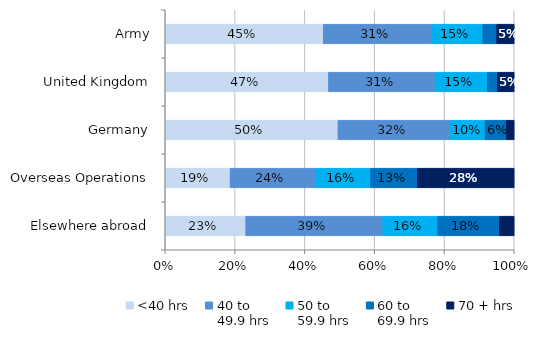
| Category | <40 hrs | 40 to 
49.9 hrs | 50 to 
59.9 hrs | 60 to 
69.9 hrs | 70 + hrs |
|---|---|---|---|---|---|
| Army | 0.453 | 0.309 | 0.148 | 0.04 | 0.05 |
| United Kingdom | 0.468 | 0.305 | 0.15 | 0.029 | 0.048 |
| Germany | 0.495 | 0.323 | 0.099 | 0.061 | 0.022 |
| Overseas Operations | 0.186 | 0.244 | 0.159 | 0.134 | 0.278 |
| Elsewhere abroad | 0.231 | 0.393 | 0.158 | 0.176 | 0.042 |